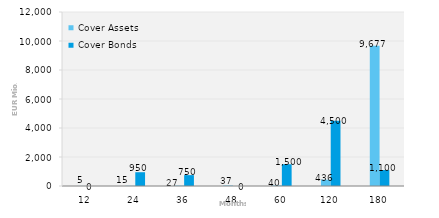
| Category | Cover Assets | Cover Bonds |
|---|---|---|
| 12.0 | 4.649 | 0 |
| 24.0 | 14.936 | 950 |
| 36.0 | 27.415 | 750 |
| 48.0 | 37.008 | 0 |
| 60.0 | 39.857 | 1500 |
| 120.0 | 435.738 | 4500 |
| 180.0 | 9676.922 | 1100 |